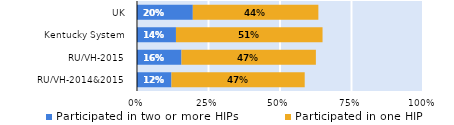
| Category | Participated in two or more HIPs | Participated in one HIP |
|---|---|---|
| RU/VH-2014&2015 | 0.12 | 0.466 |
| RU/VH-2015 | 0.155 | 0.47 |
| Kentucky System | 0.136 | 0.513 |
| UK | 0.195 | 0.439 |